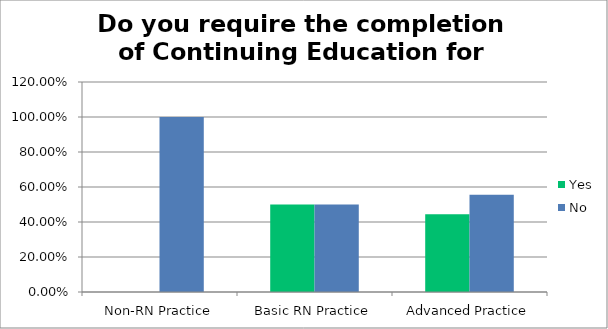
| Category | Yes | No |
|---|---|---|
| Non-RN Practice | 0 | 1 |
| Basic RN Practice | 0.5 | 0.5 |
| Advanced Practice | 0.444 | 0.556 |